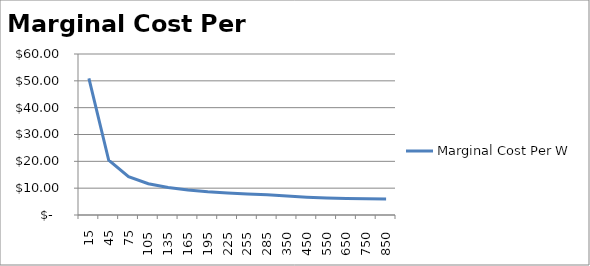
| Category | Marginal Cost Per W |
|---|---|
| 15.0 | 50.937 |
| 45.0 | 20.396 |
| 75.0 | 14.288 |
| 105.0 | 11.67 |
| 135.0 | 10.216 |
| 165.0 | 9.291 |
| 195.0 | 8.65 |
| 225.0 | 8.18 |
| 255.0 | 7.821 |
| 285.0 | 7.537 |
| 350.0 | 7.089 |
| 450.0 | 6.653 |
| 550.0 | 6.375 |
| 650.0 | 6.183 |
| 750.0 | 6.042 |
| 850.0 | 5.934 |